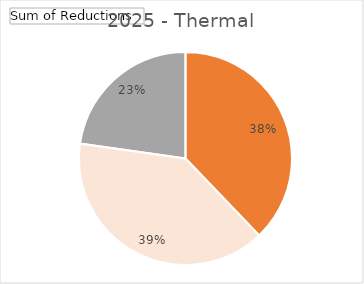
| Category | 2025 |
|---|---|
| 0 | 0.378 |
| 1 | 0.394 |
| 2 | 0.228 |